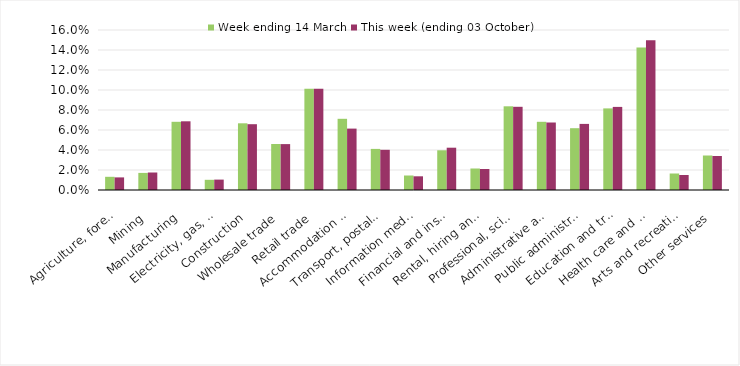
| Category | Week ending 14 March | This week (ending 03 October) |
|---|---|---|
| Agriculture, forestry and fishing | 0.013 | 0.013 |
| Mining | 0.017 | 0.018 |
| Manufacturing | 0.068 | 0.069 |
| Electricity, gas, water and waste services | 0.01 | 0.01 |
| Construction | 0.067 | 0.066 |
| Wholesale trade | 0.046 | 0.046 |
| Retail trade | 0.101 | 0.101 |
| Accommodation and food services | 0.071 | 0.061 |
| Transport, postal and warehousing | 0.041 | 0.04 |
| Information media and telecommunications | 0.014 | 0.014 |
| Financial and insurance services | 0.04 | 0.042 |
| Rental, hiring and real estate services | 0.022 | 0.021 |
| Professional, scientific and technical services | 0.084 | 0.083 |
| Administrative and support services | 0.068 | 0.068 |
| Public administration and safety | 0.062 | 0.066 |
| Education and training | 0.082 | 0.083 |
| Health care and social assistance | 0.142 | 0.15 |
| Arts and recreation services | 0.016 | 0.015 |
| Other services | 0.034 | 0.034 |